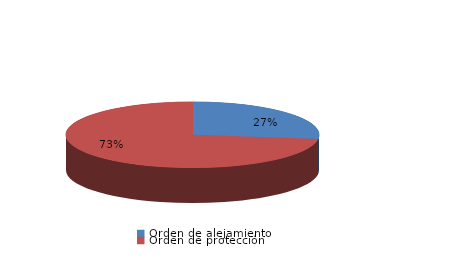
| Category | Series 0 |
|---|---|
| Orden de alejamiento | 23 |
| Orden de protección | 62 |